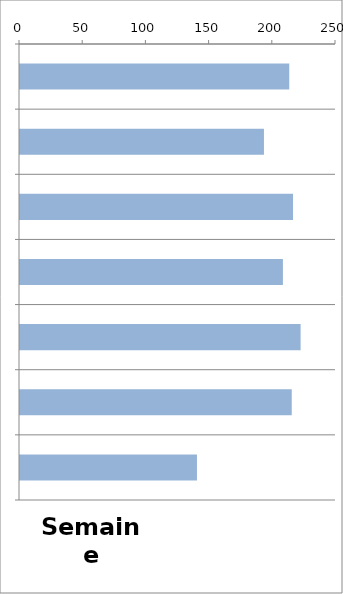
| Category | TV |
|---|---|
| 0 | 213 |
| 1 | 193 |
| 2 | 216 |
| 3 | 208 |
| 4 | 222 |
| 5 | 215 |
| 6 | 140 |